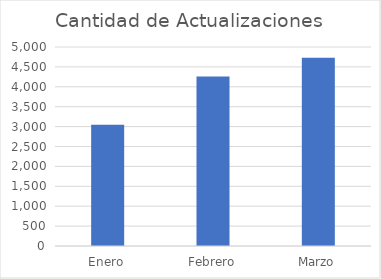
| Category | Cantidad de Actualizaciones |
|---|---|
| Enero | 3045 |
| Febrero | 4261 |
| Marzo | 4730 |